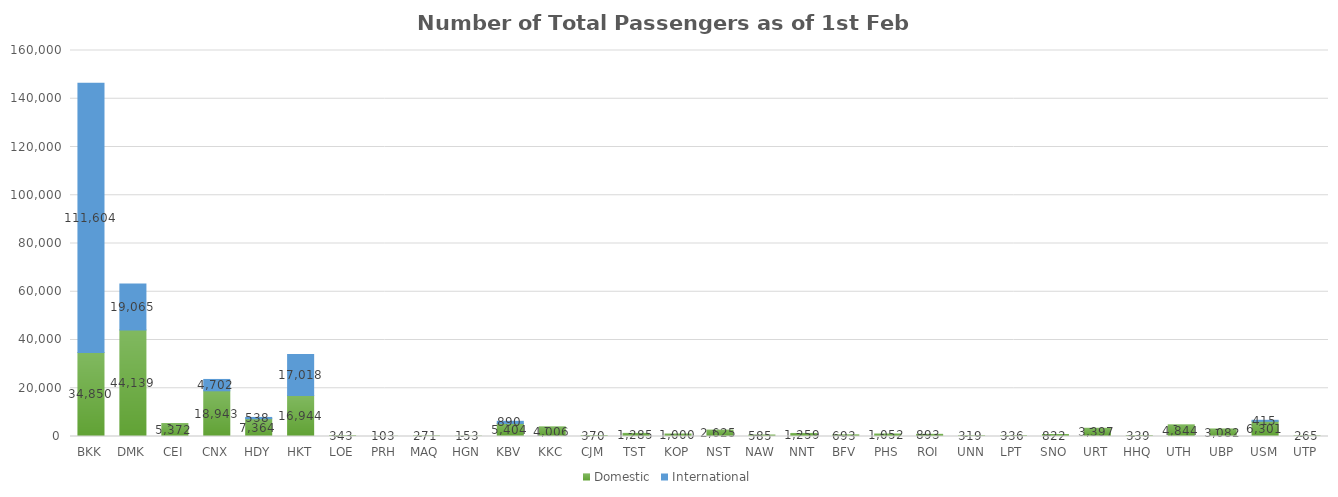
| Category | Domestic | International |
|---|---|---|
| BKK | 34850 | 111604 |
| DMK | 44139 | 19065 |
| CEI | 5372 | 0 |
| CNX | 18943 | 4702 |
| HDY | 7364 | 538 |
| HKT | 16944 | 17018 |
| LOE | 343 | 0 |
| PRH | 103 | 0 |
| MAQ | 271 | 0 |
| HGN | 153 | 0 |
| KBV | 5404 | 890 |
| KKC | 4006 | 0 |
| CJM | 370 | 0 |
| TST | 1285 | 0 |
| KOP | 1000 | 0 |
| NST | 2625 | 0 |
| NAW | 585 | 0 |
| NNT | 1259 | 0 |
| BFV | 693 | 0 |
| PHS | 1052 | 0 |
| ROI | 893 | 0 |
| UNN | 319 | 0 |
| LPT | 336 | 0 |
| SNO | 822 | 0 |
| URT | 3397 | 0 |
| HHQ | 339 | 0 |
| UTH | 4844 | 0 |
| UBP | 3082 | 0 |
| USM | 6301 | 415 |
| UTP | 265 | 0 |